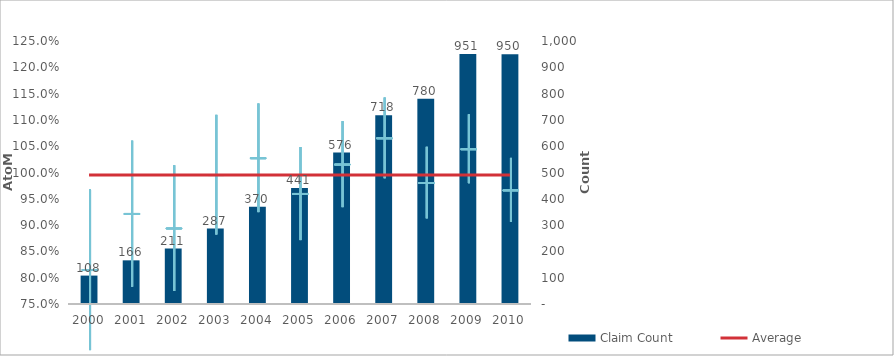
| Category | Claim Count |
|---|---|
| 0 | 108 |
| 1 | 166 |
| 2 | 211 |
| 3 | 287 |
| 4 | 370 |
| 5 | 441 |
| 6 | 576 |
| 7 | 718 |
| 8 | 780 |
| 9 | 951 |
| 10 | 950 |